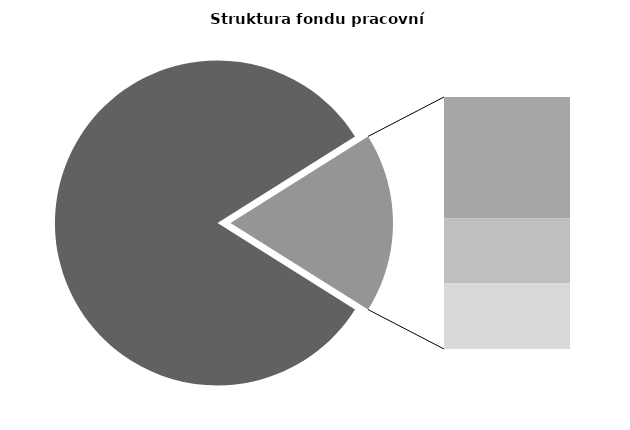
| Category | Series 0 |
|---|---|
| Průměrná měsíční odpracovaná doba bez přesčasu | 139.498 |
| Dovolená | 14.622 |
| Nemoc | 7.863 |
| Jiné | 7.897 |